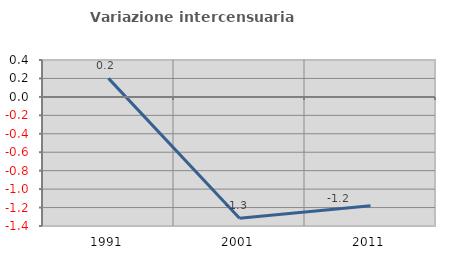
| Category | Variazione intercensuaria annua |
|---|---|
| 1991.0 | 0.201 |
| 2001.0 | -1.316 |
| 2011.0 | -1.18 |